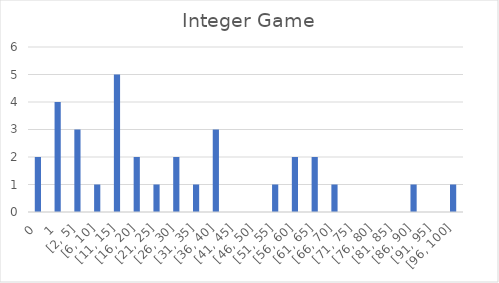
| Category | Integer Game |
|---|---|
| 0 | 2 |
| 1 | 4 |
| [2, 5] | 3 |
| [6, 10] | 1 |
| [11, 15] | 5 |
| [16, 20] | 2 |
| [21, 25] | 1 |
| [26, 30] | 2 |
| [31, 35] | 1 |
| [36, 40] | 3 |
| [41, 45] | 0 |
| [46, 50] | 0 |
| [51, 55] | 1 |
| [56, 60] | 2 |
| [61, 65] | 2 |
| [66, 70] | 1 |
| [71, 75] | 0 |
| [76, 80] | 0 |
| [81, 85] | 0 |
| [86, 90] | 1 |
| [91, 95] | 0 |
| [96, 100] | 1 |